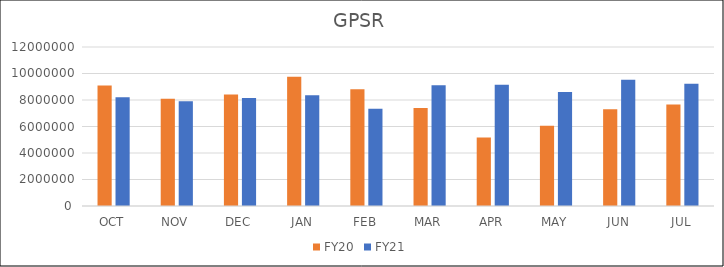
| Category | FY20 | FY21 |
|---|---|---|
| OCT | 9103245.85 | 8209636.2 |
| NOV | 8086083.63 | 7909816.04 |
| DEC | 8409375.08 | 8152569.02 |
| JAN | 9746099.93 | 8366974.1 |
| FEB | 8809633.74 | 7339002.85 |
| MAR | 7396883.76 | 9117539.82 |
| APR | 5172054.99 | 9147608.47 |
| MAY | 6059671.71 | 8611188.25 |
| JUN | 7302886.61 | 9524907.12 |
| JUL | 7656994.5 | 9235394.04 |